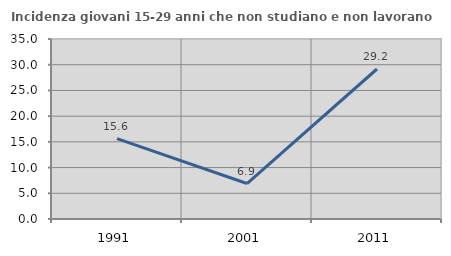
| Category | Incidenza giovani 15-29 anni che non studiano e non lavorano  |
|---|---|
| 1991.0 | 15.616 |
| 2001.0 | 6.897 |
| 2011.0 | 29.167 |